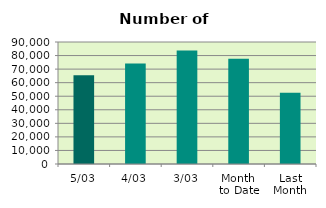
| Category | Series 0 |
|---|---|
| 5/03 | 65442 |
| 4/03 | 74070 |
| 3/03 | 83814 |
| Month 
to Date | 77727 |
| Last
Month | 52501.6 |